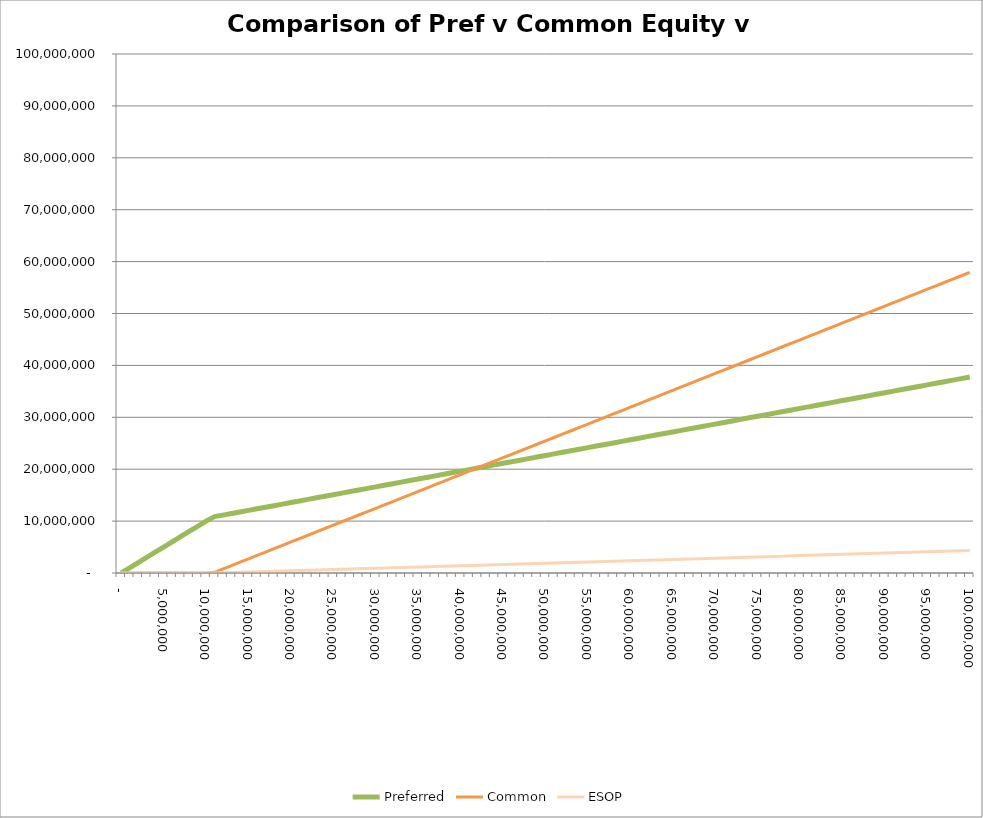
| Category | Preferred | Common | ESOP |
|---|---|---|---|
| 0.0 | 0 | 0 | 0 |
| 1000000.0 | 1000000 | 0 | 0 |
| 2000000.0 | 2000000 | 0 | 0 |
| 3000000.0 | 3000000 | 0 | 0 |
| 4000000.0 | 4000000 | 0 | 0 |
| 5000000.0 | 5000000 | 0 | 0 |
| 6000000.0 | 6000000 | 0 | 0 |
| 7000000.0 | 7000000 | 0 | 0 |
| 8000000.0 | 8000000 | 0 | 0 |
| 9000000.0 | 9000000 | 0 | 0 |
| 10000000.0 | 10000000 | 0 | 0 |
| 11000000.0 | 10856705.554 | 133358.242 | 9936.204 |
| 12000000.0 | 11158984.62 | 782698.392 | 58316.989 |
| 13000000.0 | 11461263.686 | 1432038.542 | 106697.773 |
| 14000000.0 | 11763542.752 | 2081378.691 | 155078.557 |
| 15000000.0 | 12065821.818 | 2730718.841 | 203459.341 |
| 16000000.0 | 12368100.883 | 3380058.991 | 251840.126 |
| 17000000.0 | 12670379.949 | 4029399.141 | 300220.91 |
| 18000000.0 | 12972659.015 | 4678739.29 | 348601.694 |
| 19000000.0 | 13274938.081 | 5328079.44 | 396982.478 |
| 20000000.0 | 13577217.147 | 5977419.59 | 445363.263 |
| 21000000.0 | 13879496.213 | 6626759.74 | 493744.047 |
| 22000000.0 | 14181775.279 | 7276099.889 | 542124.831 |
| 23000000.0 | 14484054.345 | 7925440.039 | 590505.616 |
| 24000000.0 | 14786333.411 | 8574780.189 | 638886.4 |
| 25000000.0 | 15088612.477 | 9224120.339 | 687267.184 |
| 26000000.0 | 15390891.543 | 9873460.489 | 735647.968 |
| 27000000.0 | 15693170.609 | 10522800.638 | 784028.753 |
| 28000000.0 | 15995449.675 | 11172140.788 | 832409.537 |
| 29000000.0 | 16297728.741 | 11821480.938 | 880790.321 |
| 30000000.0 | 16600007.807 | 12470821.088 | 929171.105 |
| 31000000.0 | 16902286.873 | 13120161.237 | 977551.89 |
| 32000000.0 | 17204565.939 | 13769501.387 | 1025932.674 |
| 33000000.0 | 17506845.005 | 14418841.537 | 1074313.458 |
| 34000000.0 | 17809124.071 | 15068181.687 | 1122694.243 |
| 35000000.0 | 18111403.137 | 15717521.836 | 1171075.027 |
| 36000000.0 | 18413682.203 | 16366861.986 | 1219455.811 |
| 37000000.0 | 18715961.269 | 17016202.136 | 1267836.595 |
| 38000000.0 | 19018240.335 | 17665542.286 | 1316217.38 |
| 39000000.0 | 19320519.401 | 18314882.435 | 1364598.164 |
| 40000000.0 | 19622798.467 | 18964222.585 | 1412978.948 |
| 41000000.0 | 19925077.533 | 19613562.735 | 1461359.732 |
| 42000000.0 | 20227356.599 | 20262902.885 | 1509740.517 |
| 43000000.0 | 20529635.665 | 20912243.034 | 1558121.301 |
| 44000000.0 | 20831914.731 | 21561583.184 | 1606502.085 |
| 45000000.0 | 21134193.796 | 22210923.334 | 1654882.87 |
| 46000000.0 | 21436472.862 | 22860263.484 | 1703263.654 |
| 47000000.0 | 21738751.928 | 23509603.634 | 1751644.438 |
| 48000000.0 | 22041030.994 | 24158943.783 | 1800025.222 |
| 49000000.0 | 22343310.06 | 24808283.933 | 1848406.007 |
| 50000000.0 | 22645589.126 | 25457624.083 | 1896786.791 |
| 51000000.0 | 22947868.192 | 26106964.233 | 1945167.575 |
| 52000000.0 | 23250147.258 | 26756304.382 | 1993548.359 |
| 53000000.0 | 23552426.324 | 27405644.532 | 2041929.144 |
| 54000000.0 | 23854705.39 | 28054984.682 | 2090309.928 |
| 55000000.0 | 24156984.456 | 28704324.832 | 2138690.712 |
| 56000000.0 | 24459263.522 | 29353664.981 | 2187071.497 |
| 57000000.0 | 24761542.588 | 30003005.131 | 2235452.281 |
| 58000000.0 | 25063821.654 | 30652345.281 | 2283833.065 |
| 59000000.0 | 25366100.72 | 31301685.431 | 2332213.849 |
| 60000000.0 | 25668379.786 | 31951025.58 | 2380594.634 |
| 61000000.0 | 25970658.852 | 32600365.73 | 2428975.418 |
| 62000000.0 | 26272937.918 | 33249705.88 | 2477356.202 |
| 63000000.0 | 26575216.984 | 33899046.03 | 2525736.986 |
| 64000000.0 | 26877496.05 | 34548386.179 | 2574117.771 |
| 65000000.0 | 27179775.116 | 35197726.329 | 2622498.555 |
| 66000000.0 | 27482054.182 | 35847066.479 | 2670879.339 |
| 67000000.0 | 27784333.248 | 36496406.629 | 2719260.124 |
| 68000000.0 | 28086612.314 | 37145746.779 | 2767640.908 |
| 69000000.0 | 28388891.38 | 37795086.928 | 2816021.692 |
| 70000000.0 | 28691170.446 | 38444427.078 | 2864402.476 |
| 71000000.0 | 28993449.512 | 39093767.228 | 2912783.261 |
| 72000000.0 | 29295728.578 | 39743107.378 | 2961164.045 |
| 73000000.0 | 29598007.644 | 40392447.527 | 3009544.829 |
| 74000000.0 | 29900286.709 | 41041787.677 | 3057925.613 |
| 75000000.0 | 30202565.775 | 41691127.827 | 3106306.398 |
| 76000000.0 | 30504844.841 | 42340467.977 | 3154687.182 |
| 77000000.0 | 30807123.907 | 42989808.126 | 3203067.966 |
| 78000000.0 | 31109402.973 | 43639148.276 | 3251448.751 |
| 79000000.0 | 31411682.039 | 44288488.426 | 3299829.535 |
| 80000000.0 | 31713961.105 | 44937828.576 | 3348210.319 |
| 81000000.0 | 32016240.171 | 45587168.725 | 3396591.103 |
| 82000000.0 | 32318519.237 | 46236508.875 | 3444971.888 |
| 83000000.0 | 32620798.303 | 46885849.025 | 3493352.672 |
| 84000000.0 | 32923077.369 | 47535189.175 | 3541733.456 |
| 85000000.0 | 33225356.435 | 48184529.324 | 3590114.24 |
| 86000000.0 | 33527635.501 | 48833869.474 | 3638495.025 |
| 87000000.0 | 33829914.567 | 49483209.624 | 3686875.809 |
| 88000000.0 | 34132193.633 | 50132549.774 | 3735256.593 |
| 89000000.0 | 34434472.699 | 50781889.924 | 3783637.378 |
| 90000000.0 | 34736751.765 | 51431230.073 | 3832018.162 |
| 91000000.0 | 35039030.831 | 52080570.223 | 3880398.946 |
| 92000000.0 | 35341309.897 | 52729910.373 | 3928779.73 |
| 93000000.0 | 35643588.963 | 53379250.523 | 3977160.515 |
| 94000000.0 | 35945868.029 | 54028590.672 | 4025541.299 |
| 95000000.0 | 36248147.095 | 54677930.822 | 4073922.083 |
| 96000000.0 | 36550426.161 | 55327270.972 | 4122302.867 |
| 97000000.0 | 36852705.227 | 55976611.122 | 4170683.652 |
| 98000000.0 | 37154984.293 | 56625951.271 | 4219064.436 |
| 99000000.0 | 37457263.359 | 57275291.421 | 4267445.22 |
| 100000000.0 | 37759542.425 | 57924631.571 | 4315826.005 |